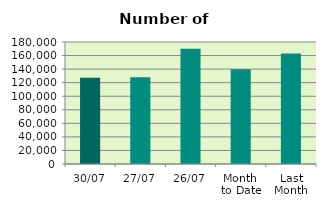
| Category | Series 0 |
|---|---|
| 30/07 | 127368 |
| 27/07 | 128040 |
| 26/07 | 170170 |
| Month 
to Date | 139635.429 |
| Last
Month | 162868.476 |